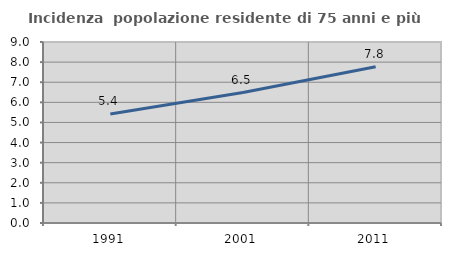
| Category | Incidenza  popolazione residente di 75 anni e più |
|---|---|
| 1991.0 | 5.416 |
| 2001.0 | 6.488 |
| 2011.0 | 7.771 |